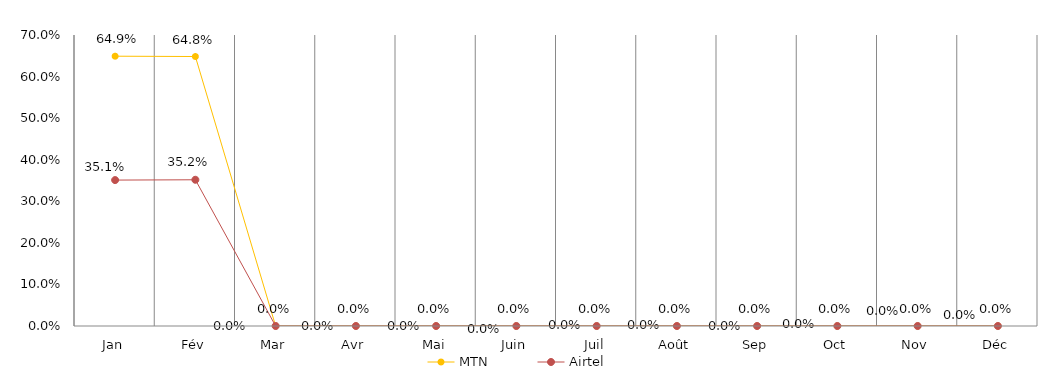
| Category | MTN | Airtel |
|---|---|---|
| Jan | 0.649 | 0.351 |
| Fév | 0.648 | 0.352 |
| Mar | 0 | 0 |
| Avr | 0 | 0 |
| Mai | 0 | 0 |
| Juin | 0 | 0 |
| Juil | 0 | 0 |
| Août | 0 | 0 |
| Sep | 0 | 0 |
| Oct | 0 | 0 |
| Nov | 0 | 0 |
| Déc | 0 | 0 |